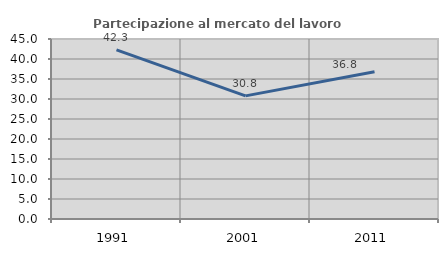
| Category | Partecipazione al mercato del lavoro  femminile |
|---|---|
| 1991.0 | 42.281 |
| 2001.0 | 30.78 |
| 2011.0 | 36.788 |